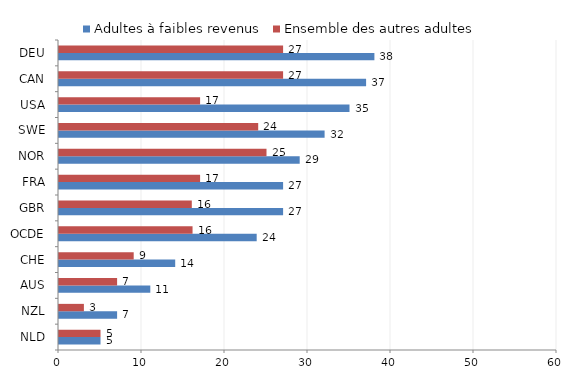
| Category | Adultes à faibles revenus | Ensemble des autres adultes  |
|---|---|---|
| NLD | 5 | 5 |
| NZL | 7 | 3 |
| AUS | 11 | 7 |
| CHE | 14 | 9 |
| OCDE | 23.818 | 16.091 |
| GBR | 27 | 16 |
| FRA | 27 | 17 |
| NOR | 29 | 25 |
| SWE | 32 | 24 |
| USA | 35 | 17 |
| CAN | 37 | 27 |
| DEU | 38 | 27 |